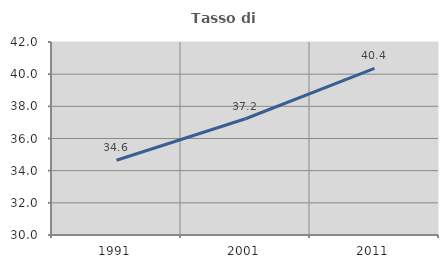
| Category | Tasso di occupazione   |
|---|---|
| 1991.0 | 34.648 |
| 2001.0 | 37.229 |
| 2011.0 | 40.364 |